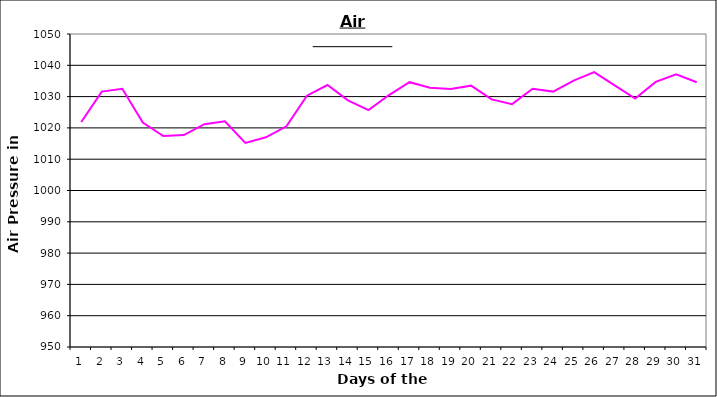
| Category | Series 0 |
|---|---|
| 0 | 1021.9 |
| 1 | 1031.6 |
| 2 | 1032.5 |
| 3 | 1021.7 |
| 4 | 1017.4 |
| 5 | 1017.7 |
| 6 | 1021.2 |
| 7 | 1022.1 |
| 8 | 1015.2 |
| 9 | 1017 |
| 10 | 1020.5 |
| 11 | 1030.3 |
| 12 | 1033.7 |
| 13 | 1028.8 |
| 14 | 1025.7 |
| 15 | 1030.5 |
| 16 | 1034.6 |
| 17 | 1032.8 |
| 18 | 1032.4 |
| 19 | 1033.5 |
| 20 | 1029.1 |
| 21 | 1027.6 |
| 22 | 1032.5 |
| 23 | 1031.6 |
| 24 | 1035.1 |
| 25 | 1037.8 |
| 26 | 1033.6 |
| 27 | 1029.4 |
| 28 | 1034.7 |
| 29 | 1037.1 |
| 30 | 1034.6 |